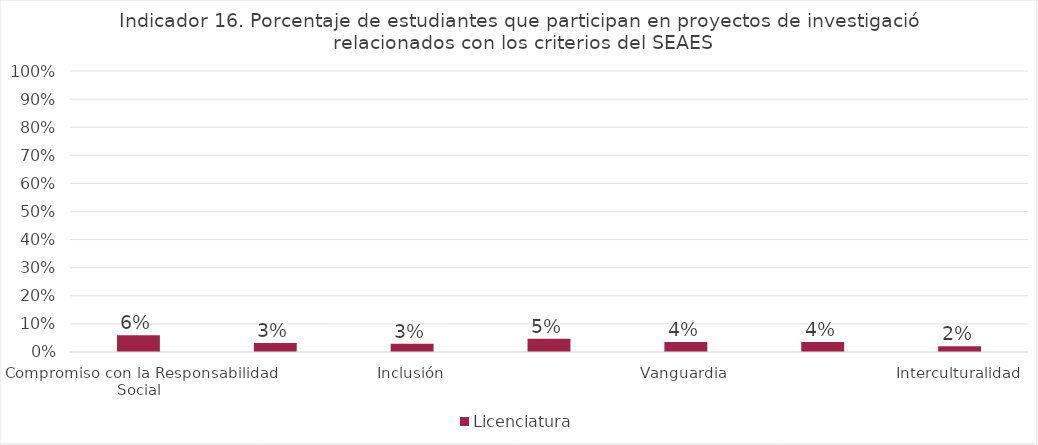
| Category | Licenciatura |
|---|---|
| Compromiso con la Responsabilidad Social | 0.059 |
| Equidad Social y de Género | 0.032 |
| Inclusión | 0.029 |
| Excelencia | 0.047 |
| Vanguardia | 0.036 |
| Innovación Social | 0.035 |
| Interculturalidad | 0.021 |